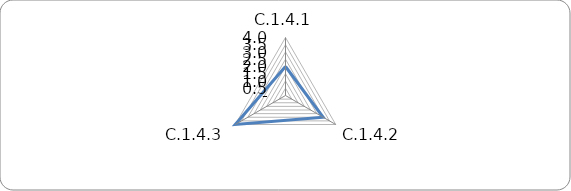
| Category | Series 0 |
|---|---|
| C.1.4.1 | 2 |
| C.1.4.2 | 3 |
| C.1.4.3 | 4 |